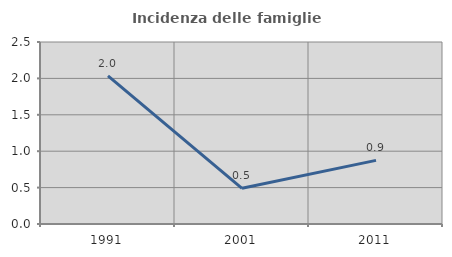
| Category | Incidenza delle famiglie numerose |
|---|---|
| 1991.0 | 2.035 |
| 2001.0 | 0.491 |
| 2011.0 | 0.874 |